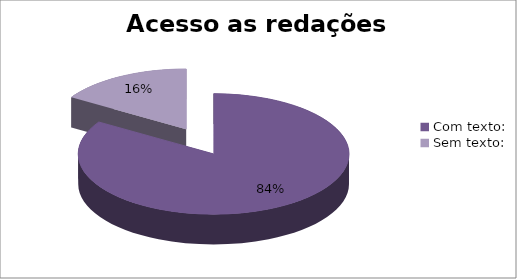
| Category | Series 0 |
|---|---|
| Com texto: | 151 |
| Sem texto: | 29 |